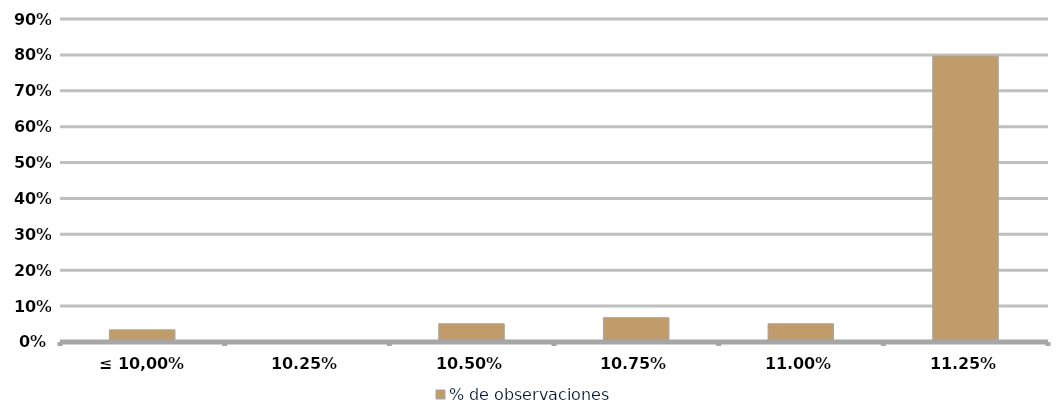
| Category | % de observaciones  |
|---|---|
| ≤ 10,00% | 0.034 |
| 10,25% | 0 |
| 10,50% | 0.051 |
| 10,75% | 0.068 |
| 11,00% | 0.051 |
| 11,25% | 0.797 |